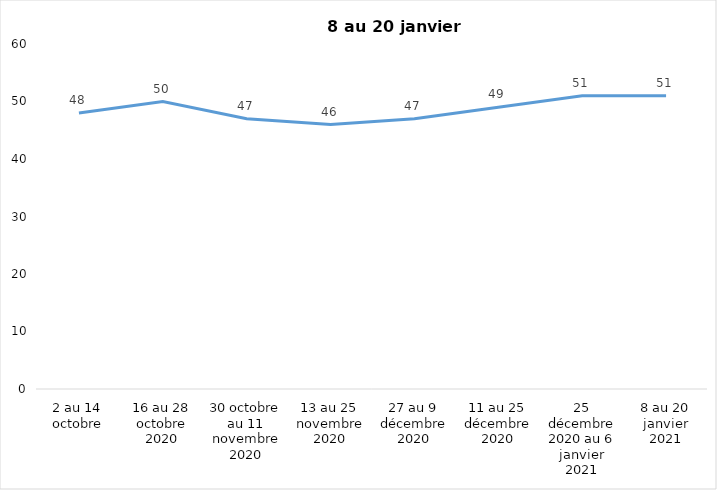
| Category | Toujours aux trois mesures |
|---|---|
| 2 au 14 octobre | 48 |
| 16 au 28 octobre 2020 | 50 |
| 30 octobre au 11 novembre 2020 | 47 |
| 13 au 25 novembre 2020 | 46 |
| 27 au 9 décembre 2020 | 47 |
| 11 au 25 décembre 2020 | 49 |
| 25 décembre 2020 au 6 janvier 2021 | 51 |
| 8 au 20 janvier 2021 | 51 |